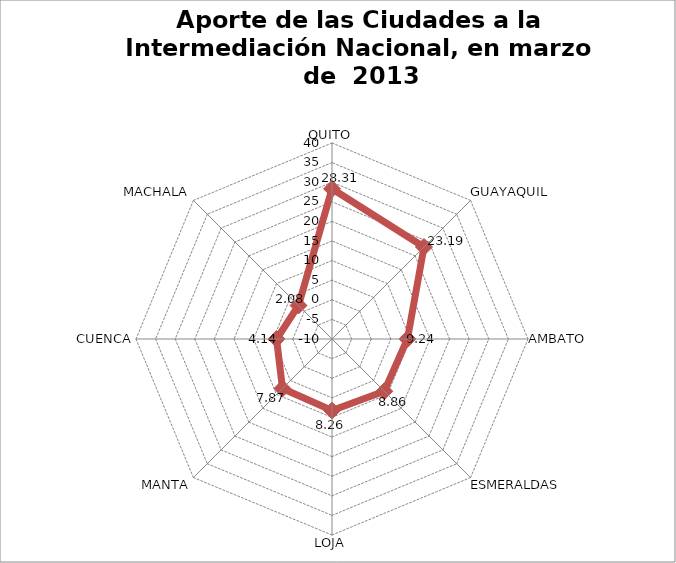
| Category | Series 0 |
|---|---|
| QUITO | 28.309 |
| GUAYAQUIL | 23.188 |
| AMBATO | 9.243 |
| ESMERALDAS  | 8.862 |
| LOJA | 8.258 |
| MANTA | 7.865 |
| CUENCA | 4.139 |
| MACHALA | 2.081 |